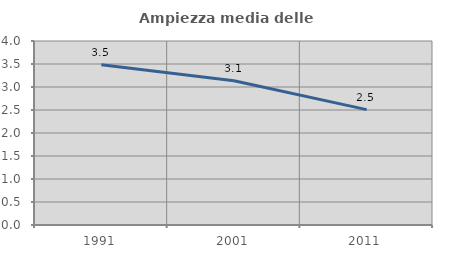
| Category | Ampiezza media delle famiglie |
|---|---|
| 1991.0 | 3.483 |
| 2001.0 | 3.138 |
| 2011.0 | 2.509 |